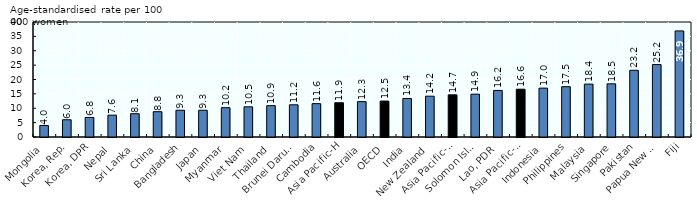
| Category | Mortality rate |
|---|---|
| Mongolia | 4 |
| Korea, Rep. | 6 |
| Korea, DPR | 6.8 |
| Nepal | 7.6 |
| Sri Lanka | 8.1 |
| China | 8.8 |
| Bangladesh | 9.3 |
| Japan | 9.3 |
| Myanmar | 10.2 |
| Viet Nam | 10.5 |
| Thailand | 10.9 |
| Brunei Darussalam | 11.2 |
| Cambodia | 11.6 |
| Asia Pacific-H | 11.917 |
| Australia | 12.3 |
| OECD | 12.5 |
| India | 13.4 |
| New Zealand | 14.2 |
| Asia Pacific-LM/L | 14.663 |
| Solomon Islands | 14.9 |
| Lao, PDR | 16.2 |
| Asia Pacific-UM | 16.62 |
| Indonesia | 17 |
| Philippines | 17.5 |
| Malaysia | 18.4 |
| Singapore | 18.5 |
| Pakistan | 23.2 |
| Papua New Guinea | 25.2 |
| Fiji | 36.9 |